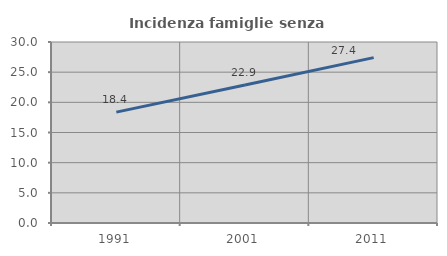
| Category | Incidenza famiglie senza nuclei |
|---|---|
| 1991.0 | 18.381 |
| 2001.0 | 22.881 |
| 2011.0 | 27.411 |